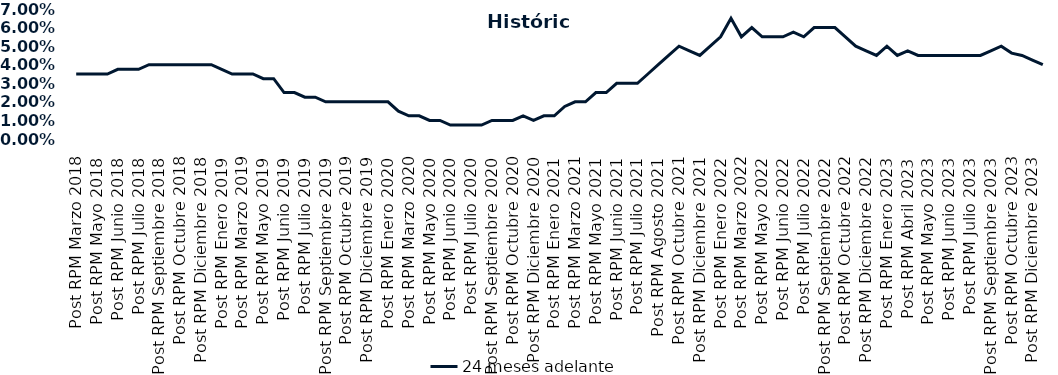
| Category | 24 meses adelante  |
|---|---|
| Post RPM Marzo 2018 | 0.035 |
| Pre RPM Mayo 2018 | 0.035 |
| Post RPM Mayo 2018 | 0.035 |
| Pre RPM Junio 2018 | 0.035 |
| Post RPM Junio 2018 | 0.038 |
| Pre RPM Julio 2018 | 0.038 |
| Post RPM Julio 2018 | 0.038 |
| Pre RPM Septiembre 2018 | 0.04 |
| Post RPM Septiembre 2018 | 0.04 |
| Pre RPM Octubre 2018 | 0.04 |
| Post RPM Octubre 2018 | 0.04 |
| Pre RPM Diciembre 2018 | 0.04 |
| Post RPM Diciembre 2018 | 0.04 |
| Pre RPM Enero 2019 | 0.04 |
| Post RPM Enero 2019 | 0.038 |
| Pre RPM Marzo 2019 | 0.035 |
| Post RPM Marzo 2019 | 0.035 |
| Pre RPM Mayo 2019 | 0.035 |
| Post RPM Mayo 2019 | 0.032 |
| Pre RPM Junio 2019 | 0.032 |
| Post RPM Junio 2019 | 0.025 |
| Pre RPM Julio 2019 | 0.025 |
| Post RPM Julio 2019 | 0.022 |
| Pre RPM Septiembre 2019 | 0.022 |
| Post RPM Septiembre 2019 | 0.02 |
| Pre RPM Octubre 2019 | 0.02 |
| Post RPM Octubre 2019 | 0.02 |
| Pre RPM Diciembre 2019 | 0.02 |
| Post RPM Diciembre 2019 | 0.02 |
| Pre RPM Enero 2020 | 0.02 |
| Post RPM Enero 2020 | 0.02 |
| Pre RPM Marzo 2020 | 0.015 |
| Post RPM Marzo 2020 | 0.012 |
| Pre RPM Mayo 2020 | 0.012 |
| Post RPM Mayo 2020 | 0.01 |
| Pre RPM Junio 2020 | 0.01 |
| Post RPM Junio 2020 | 0.008 |
| Pre RPM Julio 2020 | 0.008 |
| Post RPM Julio 2020 | 0.008 |
| Pre RPM Septiembre 2020 | 0.008 |
| Post RPM Septiembre 2020 | 0.01 |
| Pre RPM Octubre 2020 | 0.01 |
| Post RPM Octubre 2020 | 0.01 |
| Pre RPM Diciembre 2020 | 0.012 |
| Post RPM Diciembre 2020 | 0.01 |
| Pre RPM Enero 2021 | 0.012 |
| Post RPM Enero 2021 | 0.012 |
| Pre RPM Marzo 2021 | 0.018 |
| Post RPM Marzo 2021 | 0.02 |
| Pre RPM Mayo 2021 | 0.02 |
| Post RPM Mayo 2021 | 0.025 |
| Pre RPM Junio 2021 | 0.025 |
| Post RPM Junio 2021 | 0.03 |
| Pre RPM Julio 2021 | 0.03 |
| Post RPM Julio 2021 | 0.03 |
| Pre RPM Agosto 2021 | 0.035 |
| Post RPM Agosto 2021 | 0.04 |
| Pre RPM Octubre 2021 | 0.045 |
| Post RPM Octubre 2021 | 0.05 |
| Pre RPM Diciembre 2021 | 0.048 |
| Post RPM Diciembre 2021 | 0.045 |
| Pre RPM Enero 2022 | 0.05 |
| Post RPM Enero 2022 | 0.055 |
| Pre RPM Marzo 2022 | 0.065 |
| Post RPM Marzo 2022 | 0.055 |
| Pre RPM Mayo 2022 | 0.06 |
| Post RPM Mayo 2022 | 0.055 |
| Pre RPM Junio 2022 | 0.055 |
| Post RPM Junio 2022 | 0.055 |
| Pre RPM Julio 2022 | 0.058 |
| Post RPM Julio 2022 | 0.055 |
| Pre RPM Septiembre 2022 | 0.06 |
| Post RPM Septiembre 2022 | 0.06 |
| Pre RPM Octubre 2022 | 0.06 |
| Post RPM Octubre 2022 | 0.055 |
| Pre RPM Diciembre 2022 | 0.05 |
| Post RPM Diciembre 2022 | 0.048 |
| Pre RPM Enero 2023 | 0.045 |
| Post RPM Enero 2023 | 0.05 |
| Pre RPM Abril 2023 | 0.045 |
| Post RPM Abril 2023 | 0.048 |
| Pre RPM Mayo 2023 | 0.045 |
| Post RPM Mayo 2023 | 0.045 |
| Pre RPM Junio 2023 | 0.045 |
| Post RPM Junio 2023 | 0.045 |
| Pre RPM Julio 2023 | 0.045 |
| Post RPM Julio 2023 | 0.045 |
| Pre RPM Septiembre 2023 | 0.045 |
| Post RPM Septiembre 2023 | 0.048 |
| Pre RPM Octubre 2023 | 0.05 |
| Post RPM Octubre 2023 | 0.046 |
| Pre RPM Diciembre 2023 | 0.045 |
| Post RPM Diciembre 2023 | 0.042 |
| Pre RPM Enero 2024 | 0.04 |